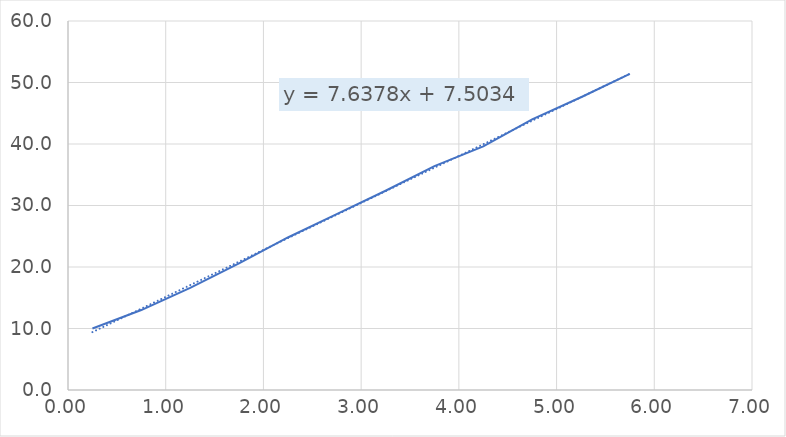
| Category | Series 0 |
|---|---|
| 0.25 | 10 |
| 0.75 | 13 |
| 1.25 | 16.6 |
| 1.75 | 20.6 |
| 2.25 | 24.8 |
| 2.75 | 28.6 |
| 3.25 | 32.4 |
| 3.75 | 36.4 |
| 4.25 | 39.6 |
| 4.75 | 44 |
| 5.25 | 47.6 |
| 5.75 | 51.4 |